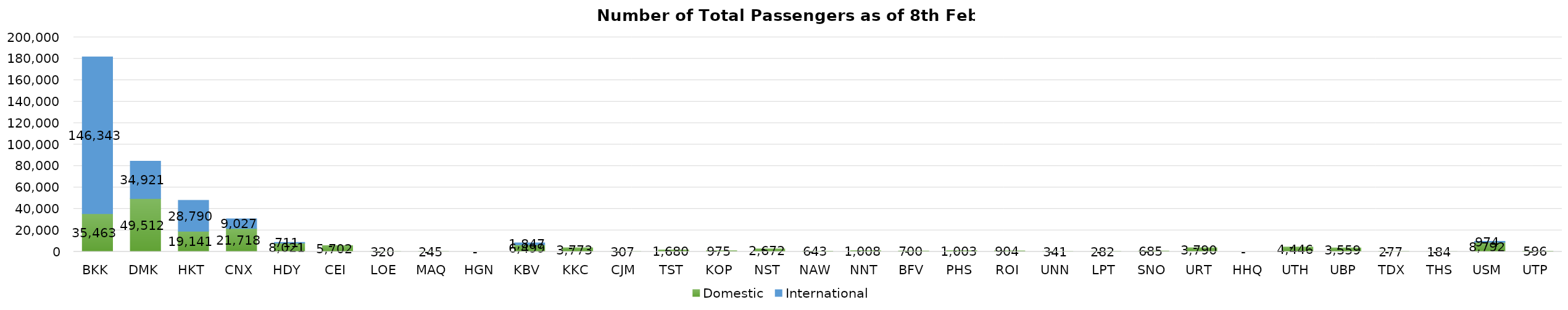
| Category | Domestic | International |
|---|---|---|
| BKK | 35463 | 146343 |
| DMK | 49512 | 34921 |
| HKT | 19141 | 28790 |
| CNX | 21718 | 9027 |
| HDY | 8021 | 711 |
| CEI | 5702 | 0 |
| LOE | 320 | 0 |
| MAQ | 245 | 0 |
| HGN | 0 | 0 |
| KBV | 6499 | 1847 |
| KKC | 3773 | 0 |
| CJM | 307 | 0 |
| TST | 1680 | 0 |
| KOP | 975 | 0 |
| NST | 2672 | 0 |
| NAW | 643 | 0 |
| NNT | 1008 | 0 |
| BFV | 700 | 0 |
| PHS | 1003 | 0 |
| ROI | 904 | 0 |
| UNN | 341 | 0 |
| LPT | 282 | 0 |
| SNO | 685 | 0 |
| URT | 3790 | 0 |
| HHQ | 0 | 0 |
| UTH | 4446 | 0 |
| UBP | 3559 | 0 |
| TDX | 277 | 0 |
| THS | 184 | 0 |
| USM | 8792 | 974 |
| UTP | 596 | 0 |